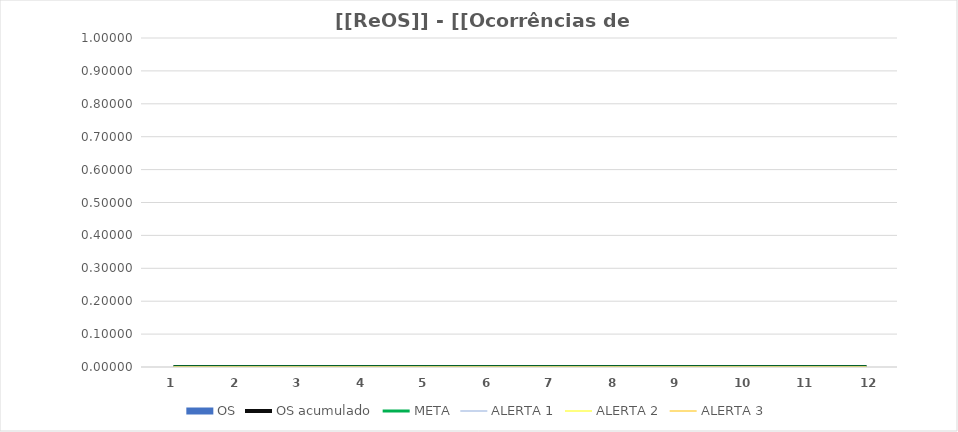
| Category | OS |
|---|---|
| 0 | 0 |
| 1 | 0 |
| 2 | 0 |
| 3 | 0 |
| 4 | 0 |
| 5 | 0 |
| 6 | 0 |
| 7 | 0 |
| 8 | 0 |
| 9 | 0 |
| 10 | 0 |
| 11 | 0 |